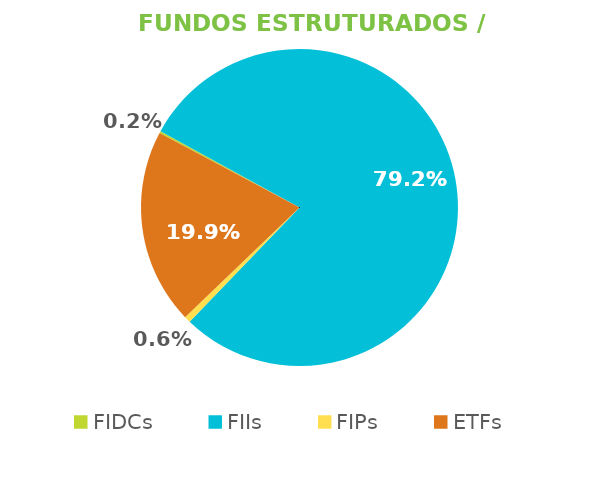
| Category | Fundos Estruturados / ETFs |
|---|---|
| FIDCs | 0.002 |
| FIIs | 0.792 |
| FIPs | 0.006 |
| ETFs | 0.199 |